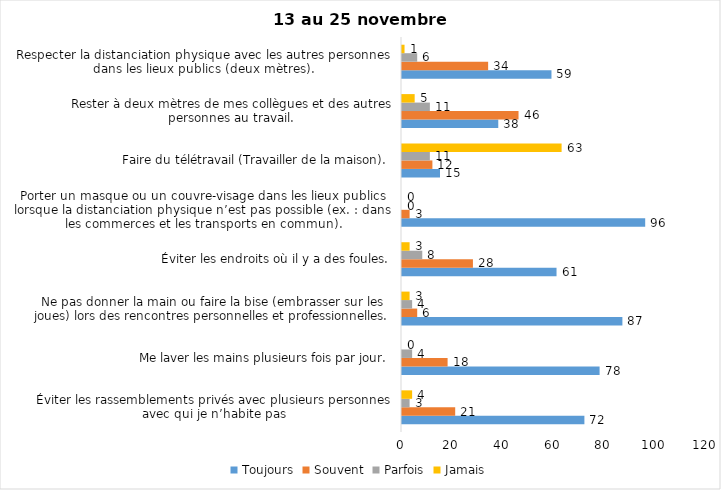
| Category | Toujours | Souvent | Parfois | Jamais |
|---|---|---|---|---|
| Éviter les rassemblements privés avec plusieurs personnes avec qui je n’habite pas | 72 | 21 | 3 | 4 |
| Me laver les mains plusieurs fois par jour. | 78 | 18 | 4 | 0 |
| Ne pas donner la main ou faire la bise (embrasser sur les joues) lors des rencontres personnelles et professionnelles. | 87 | 6 | 4 | 3 |
| Éviter les endroits où il y a des foules. | 61 | 28 | 8 | 3 |
| Porter un masque ou un couvre-visage dans les lieux publics lorsque la distanciation physique n’est pas possible (ex. : dans les commerces et les transports en commun). | 96 | 3 | 0 | 0 |
| Faire du télétravail (Travailler de la maison). | 15 | 12 | 11 | 63 |
| Rester à deux mètres de mes collègues et des autres personnes au travail. | 38 | 46 | 11 | 5 |
| Respecter la distanciation physique avec les autres personnes dans les lieux publics (deux mètres). | 59 | 34 | 6 | 1 |